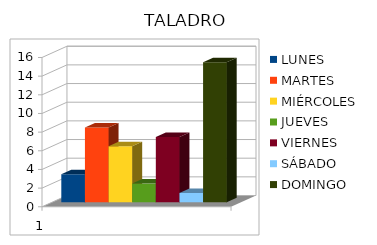
| Category | LUNES | MARTES | MIÉRCOLES | JUEVES | VIERNES | SÁBADO | DOMINGO |
|---|---|---|---|---|---|---|---|
| 0 | 3 | 8 | 6 | 2 | 7 | 1 | 15 |